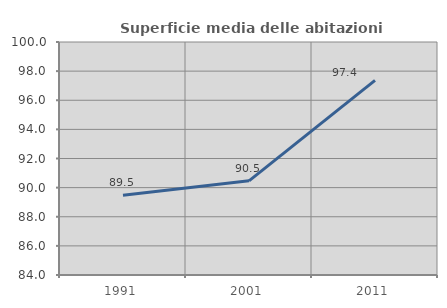
| Category | Superficie media delle abitazioni occupate |
|---|---|
| 1991.0 | 89.475 |
| 2001.0 | 90.466 |
| 2011.0 | 97.368 |